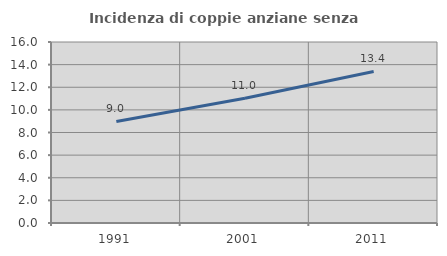
| Category | Incidenza di coppie anziane senza figli  |
|---|---|
| 1991.0 | 8.98 |
| 2001.0 | 11.028 |
| 2011.0 | 13.4 |